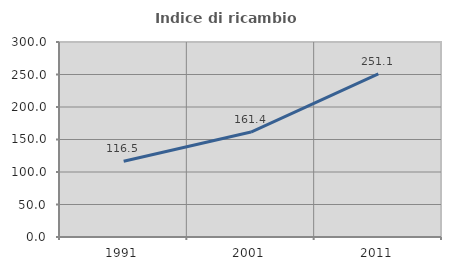
| Category | Indice di ricambio occupazionale  |
|---|---|
| 1991.0 | 116.522 |
| 2001.0 | 161.421 |
| 2011.0 | 251.111 |